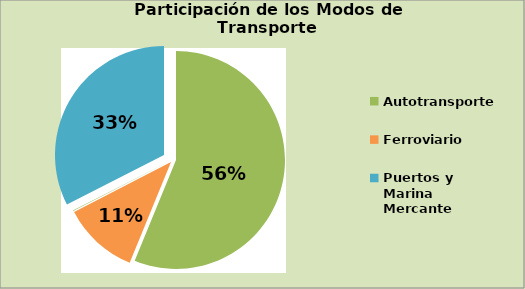
| Category | Series 0 |
|---|---|
| Autotransporte | 56.186 |
| Ferroviario | 11.229 |
| Aéreo | 0.067 |
| Puertos y Marina Mercante | 32.518 |